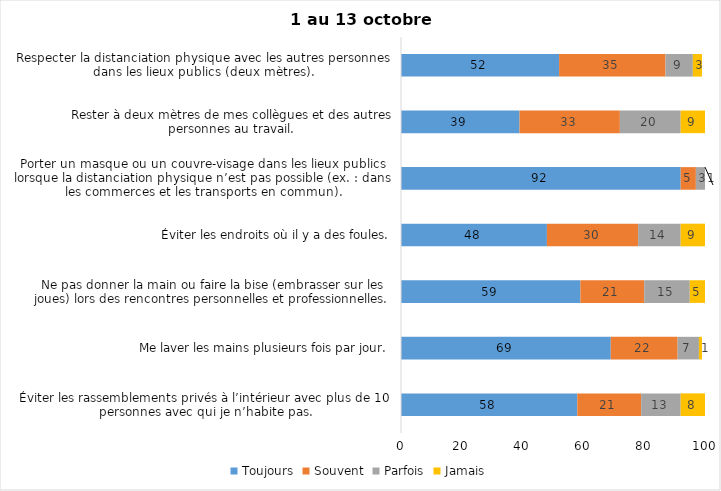
| Category | Toujours | Souvent | Parfois | Jamais |
|---|---|---|---|---|
| Éviter les rassemblements privés à l’intérieur avec plus de 10 personnes avec qui je n’habite pas. | 58 | 21 | 13 | 8 |
| Me laver les mains plusieurs fois par jour. | 69 | 22 | 7 | 1 |
| Ne pas donner la main ou faire la bise (embrasser sur les joues) lors des rencontres personnelles et professionnelles. | 59 | 21 | 15 | 5 |
| Éviter les endroits où il y a des foules. | 48 | 30 | 14 | 9 |
| Porter un masque ou un couvre-visage dans les lieux publics lorsque la distanciation physique n’est pas possible (ex. : dans les commerces et les transports en commun). | 92 | 5 | 3 | 1 |
| Rester à deux mètres de mes collègues et des autres personnes au travail. | 39 | 33 | 20 | 9 |
| Respecter la distanciation physique avec les autres personnes dans les lieux publics (deux mètres). | 52 | 35 | 9 | 3 |